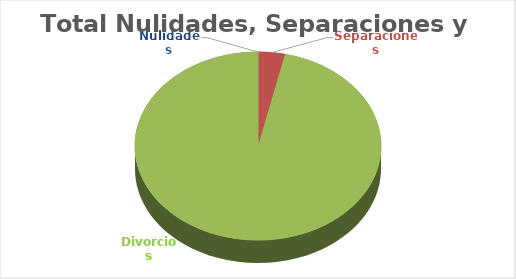
| Category | Series 0 |
|---|---|
| Nulidades | 40 |
| Separaciones | 2775 |
| Divorcios | 77200 |